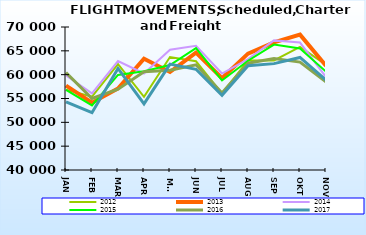
| Category | 2012 | 2013 | 2014 | 2015 | 2016 | 2017 |
|---|---|---|---|---|---|---|
| JAN | 56819 | 57714 | 59820 | 56825 | 60449 | 54284 |
| FEB | 55392 | 54126 | 56061 | 53551 | 54999 | 52025 |
| MAR | 62199 | 57109 | 62844 | 59940 | 56951 | 61307 |
| APR | 55343 | 63351 | 60249 | 60712 | 60633 | 53889 |
| MAI | 63707 | 60558 | 65236 | 62021 | 60932 | 62225 |
| JUN | 62806 | 64643 | 66038 | 65567 | 62070 | 61125 |
| JUL | 56042 | 59264 | 60236 | 58785 | 56170 | 55689 |
| AUG | 62970 | 64412 | 63263 | 62924 | 62414 | 61888 |
| SEP | 62970 | 66778 | 67191 | 66307 | 63364 | 62314 |
| OKT | 65814 | 68393 | 66736 | 65502 | 62632 | 63606 |
| NOV | 62097 | 61858 | 59497 | 60634 | 58513 | 58855 |